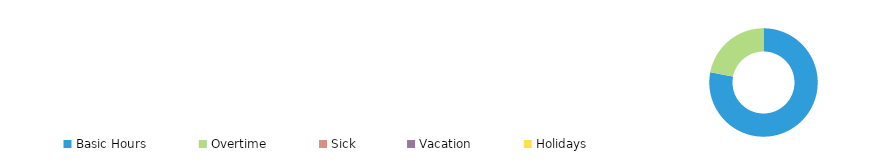
| Category | Series 2 | Series 3 |
|---|---|---|
| Basic Hours | 0.78 |  |
| Overtime | 0.22 |  |
| Sick | 0 |  |
| Vacation | 0 |  |
| Holidays | 0 |  |